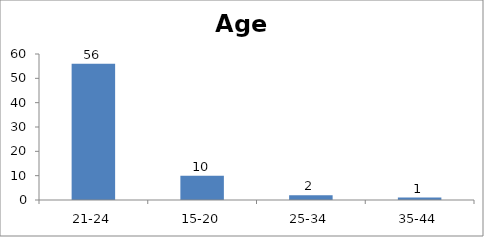
| Category | Age |
|---|---|
| 21-24 | 56 |
| 15-20 | 10 |
| 25-34 | 2 |
| 35-44 | 1 |